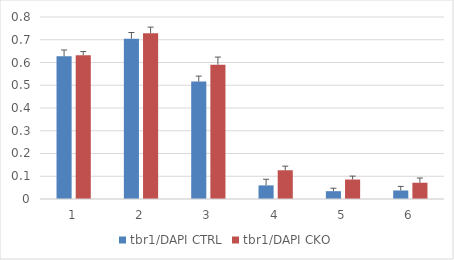
| Category | tbr1/DAPI CTRL | tbr1/DAPI CKO |
|---|---|---|
| 0 | 0.627 | 0.632 |
| 1 | 0.705 | 0.729 |
| 2 | 0.516 | 0.59 |
| 3 | 0.06 | 0.126 |
| 4 | 0.034 | 0.086 |
| 5 | 0.038 | 0.071 |